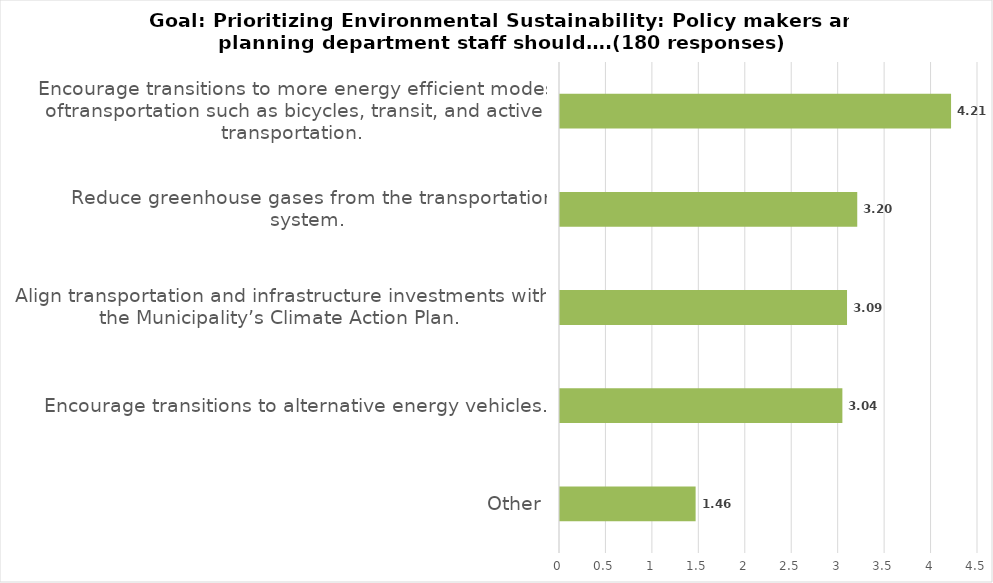
| Category | Score |
|---|---|
| Other | 1.46 |
| Encourage transitions to alternative energy vehicles. | 3.04 |
| Align transportation and infrastructure investments with the Municipality’s Climate Action Plan. | 3.09 |
| Reduce greenhouse gases from the transportation system. | 3.2 |
| Encourage transitions to more energy efficient modes oftransportation such as bicycles, transit, and active transportation. | 4.21 |